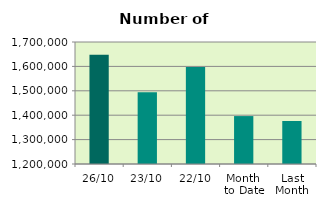
| Category | Series 0 |
|---|---|
| 26/10 | 1647828 |
| 23/10 | 1494212 |
| 22/10 | 1597164 |
| Month 
to Date | 1396407.667 |
| Last
Month | 1376245.636 |